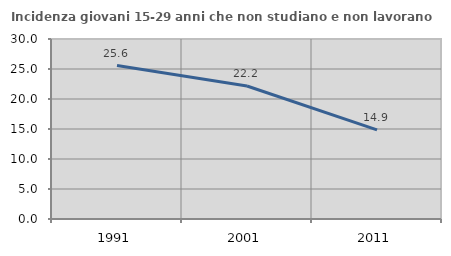
| Category | Incidenza giovani 15-29 anni che non studiano e non lavorano  |
|---|---|
| 1991.0 | 25.581 |
| 2001.0 | 22.165 |
| 2011.0 | 14.857 |